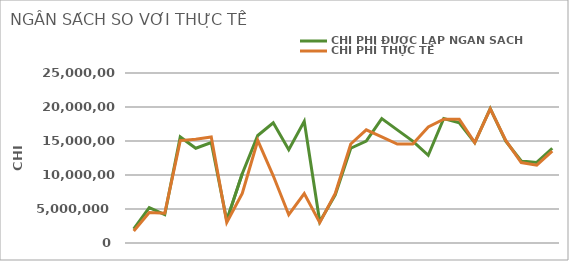
| Category | CHI PHÍ ĐƯỢC LẬP NGÂN SÁCH | CHI PHÍ THỰC TẾ |
|---|---|---|
| 0 | 2080000 | 1768000 |
| 1 | 5200000 | 4472000 |
| 2 | 4160000 | 4368000 |
| 3 | 15600000 | 15059200 |
| 4 | 13936000 | 15246400 |
| 5 | 14768000 | 15600000 |
| 6 | 3328000 | 3016000 |
| 7 | 10192000 | 7280000 |
| 8 | 15808000 | 15080000 |
| 9 | 17680000 | 9880000 |
| 10 | 13728000 | 4160000 |
| 11 | 17888000 | 7280000 |
| 12 | 3120000 | 2995200 |
| 13 | 7072000 | 7280000 |
| 14 | 13936000 | 14560000 |
| 15 | 14976000 | 16640000 |
| 16 | 18304000 | 15600000 |
| 17 | 16640000 | 14560000 |
| 18 | 14976000 | 14560000 |
| 19 | 12896000 | 17056000 |
| 20 | 18304000 | 18200000 |
| 21 | 17680000 | 18200000 |
| 22 | 14768000 | 14768000 |
| 23 | 19760000 | 19739200 |
| 24 | 14976000 | 15080000 |
| 25 | 12064000 | 11835200 |
| 26 | 11856000 | 11440000 |
| 27 | 13936000 | 13520000 |